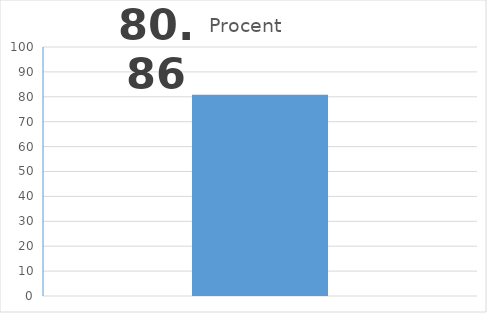
| Category | Procent |
|---|---|
| 0 | 80.86 |